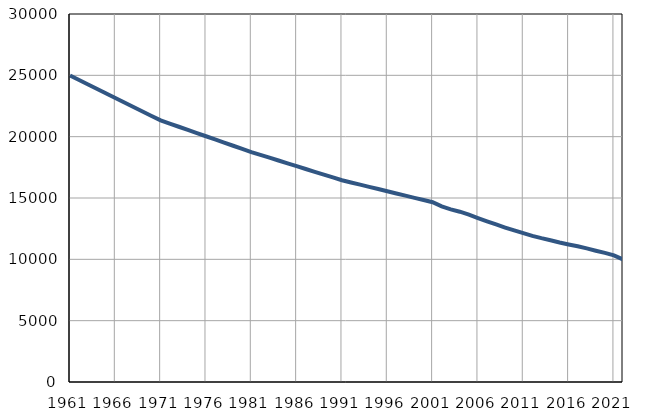
| Category | Број
становника |
|---|---|
| 1961.0 | 24982 |
| 1962.0 | 24616 |
| 1963.0 | 24252 |
| 1964.0 | 23885 |
| 1965.0 | 23519 |
| 1966.0 | 23154 |
| 1967.0 | 22788 |
| 1968.0 | 22422 |
| 1969.0 | 22055 |
| 1970.0 | 21691 |
| 1971.0 | 21325 |
| 1972.0 | 21067 |
| 1973.0 | 20809 |
| 1974.0 | 20551 |
| 1975.0 | 20293 |
| 1976.0 | 20035 |
| 1977.0 | 19776 |
| 1978.0 | 19518 |
| 1979.0 | 19260 |
| 1980.0 | 19002 |
| 1981.0 | 18744 |
| 1982.0 | 18514 |
| 1983.0 | 18285 |
| 1984.0 | 18055 |
| 1985.0 | 17825 |
| 1986.0 | 17596 |
| 1987.0 | 17366 |
| 1988.0 | 17136 |
| 1989.0 | 16906 |
| 1990.0 | 16677 |
| 1991.0 | 16447 |
| 1992.0 | 16268 |
| 1993.0 | 16088 |
| 1994.0 | 15909 |
| 1995.0 | 15730 |
| 1996.0 | 15551 |
| 1997.0 | 15371 |
| 1998.0 | 15192 |
| 1999.0 | 15013 |
| 2000.0 | 14834 |
| 2001.0 | 14654 |
| 2002.0 | 14312 |
| 2003.0 | 14073 |
| 2004.0 | 13882 |
| 2005.0 | 13645 |
| 2006.0 | 13369 |
| 2007.0 | 13101 |
| 2008.0 | 12845 |
| 2009.0 | 12593 |
| 2010.0 | 12358 |
| 2011.0 | 12132 |
| 2012.0 | 11909 |
| 2013.0 | 11725 |
| 2014.0 | 11559 |
| 2015.0 | 11377 |
| 2016.0 | 11214 |
| 2017.0 | 11065 |
| 2018.0 | 10889 |
| 2019.0 | 10702 |
| 2020.0 | 10523 |
| 2021.0 | 10325 |
| 2022.0 | 9993 |